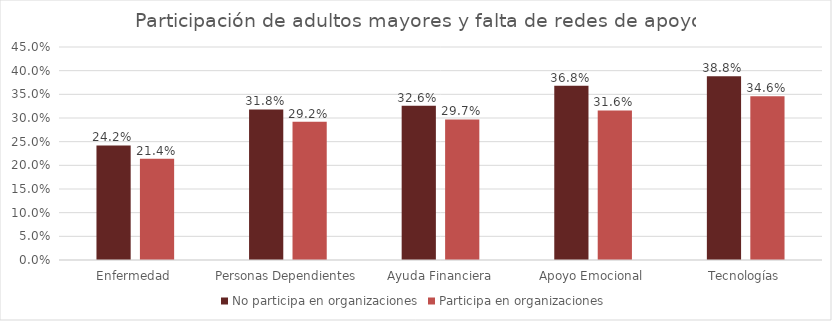
| Category | No participa en organizaciones | Participa en organizaciones |
|---|---|---|
| Enfermedad | 0.242 | 0.214 |
| Personas Dependientes | 0.318 | 0.292 |
| Ayuda Financiera | 0.326 | 0.297 |
| Apoyo Emocional | 0.368 | 0.316 |
| Tecnologías | 0.388 | 0.346 |